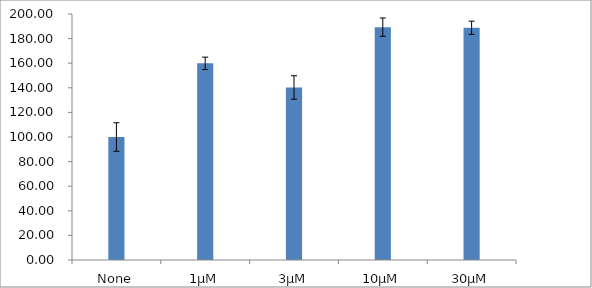
| Category | Series 0 |
|---|---|
| None | 100 |
| 1µM | 159.881 |
| 3µM | 140.256 |
| 10µM | 189.329 |
| 30µM | 188.814 |